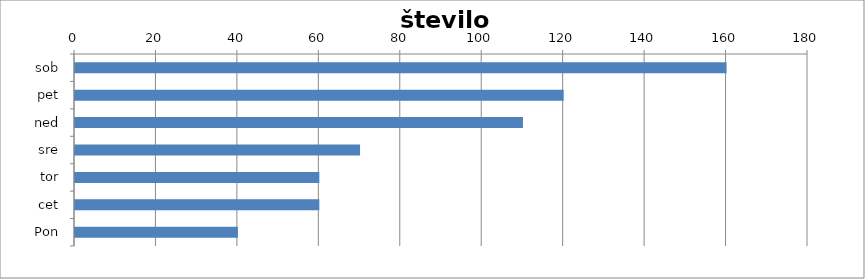
| Category | število gostov |
|---|---|
| sob | 160 |
| pet | 120 |
| ned | 110 |
| sre | 70 |
| tor | 60 |
| cet | 60 |
| Pon | 40 |